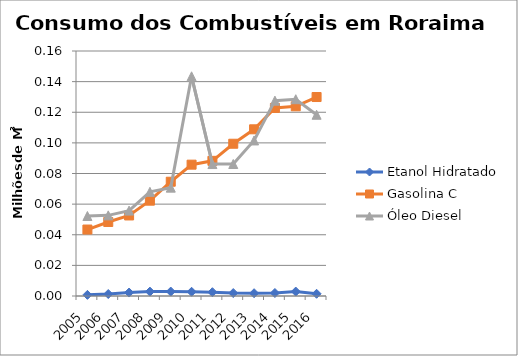
| Category | Etanol Hidratado | Gasolina C | Óleo Diesel |
|---|---|---|---|
| 2005.0 | 736.2 | 43405.65 | 52236.054 |
| 2006.0 | 1299 | 48344.95 | 52656.071 |
| 2007.0 | 2256.27 | 52591.944 | 55765.645 |
| 2008.0 | 2865.817 | 62254.191 | 68044.68 |
| 2009.0 | 2908.072 | 74627.006 | 70775.219 |
| 2010.0 | 2756.315 | 85768.4 | 143470.173 |
| 2011.0 | 2486.818 | 88273.25 | 86166.881 |
| 2012.0 | 1928.803 | 99430 | 86201.472 |
| 2013.0 | 1822.8 | 108861.3 | 101582.9 |
| 2014.0 | 1953.604 | 122815.081 | 127577.4 |
| 2015.0 | 2902.4 | 123890.243 | 128516.273 |
| 2016.0 | 1448.4 | 129943.602 | 118362.858 |